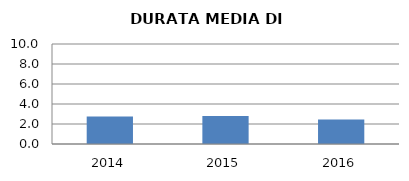
| Category | 2014 2015 2016 |
|---|---|
| 2014.0 | 2.75 |
| 2015.0 | 2.796 |
| 2016.0 | 2.444 |